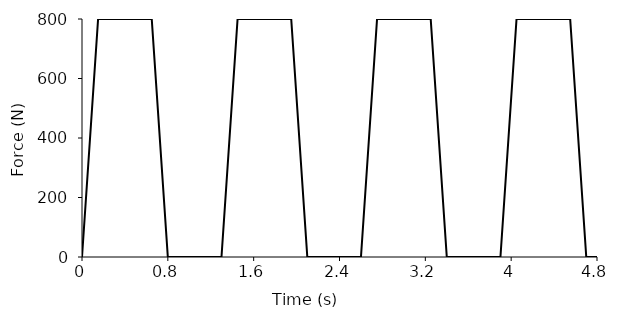
| Category | Series 0 |
|---|---|
| 0.0 | 0 |
| 0.15 | 800 |
| 0.65 | 800 |
| 0.8 | 0 |
| 1.3 | 0 |
| 1.45 | 800 |
| 1.95 | 800 |
| 2.1 | 0 |
| 2.6 | 0 |
| 2.75 | 800 |
| 3.25 | 800 |
| 3.4 | 0 |
| 3.9 | 0 |
| 4.05 | 800 |
| 4.55 | 800 |
| 4.7 | 0 |
| 4.95 | 0 |